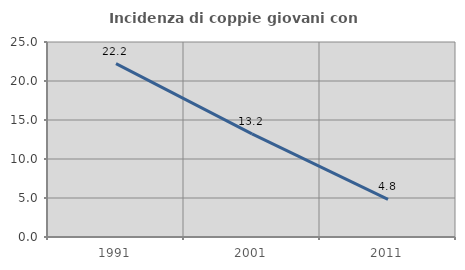
| Category | Incidenza di coppie giovani con figli |
|---|---|
| 1991.0 | 22.222 |
| 2001.0 | 13.228 |
| 2011.0 | 4.813 |